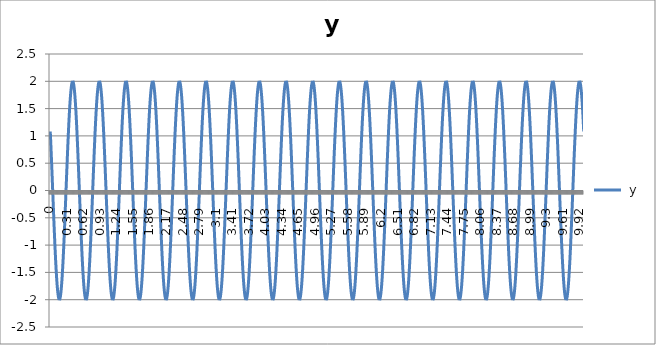
| Category |  y |
|---|---|
| 0.0 | 1.081 |
| 0.01 | 0.861 |
| 0.02 | 0.628 |
| 0.03 | 0.385 |
| 0.04 | 0.136 |
| 0.05 | -0.115 |
| 0.060000000000000005 | -0.364 |
| 0.07 | -0.608 |
| 0.08 | -0.842 |
| 0.09 | -1.063 |
| 0.09999999999999999 | -1.267 |
| 0.10999999999999999 | -1.451 |
| 0.11999999999999998 | -1.612 |
| 0.12999999999999998 | -1.747 |
| 0.13999999999999999 | -1.856 |
| 0.15 | -1.934 |
| 0.16 | -1.983 |
| 0.17 | -2 |
| 0.18000000000000002 | -1.986 |
| 0.19000000000000003 | -1.94 |
| 0.20000000000000004 | -1.863 |
| 0.21000000000000005 | -1.758 |
| 0.22000000000000006 | -1.624 |
| 0.23000000000000007 | -1.465 |
| 0.24000000000000007 | -1.283 |
| 0.25000000000000006 | -1.081 |
| 0.26000000000000006 | -0.861 |
| 0.2700000000000001 | -0.628 |
| 0.2800000000000001 | -0.385 |
| 0.2900000000000001 | -0.136 |
| 0.3000000000000001 | 0.115 |
| 0.3100000000000001 | 0.364 |
| 0.3200000000000001 | 0.608 |
| 0.3300000000000001 | 0.842 |
| 0.34000000000000014 | 1.063 |
| 0.35000000000000014 | 1.267 |
| 0.36000000000000015 | 1.451 |
| 0.37000000000000016 | 1.612 |
| 0.38000000000000017 | 1.747 |
| 0.3900000000000002 | 1.856 |
| 0.4000000000000002 | 1.934 |
| 0.4100000000000002 | 1.983 |
| 0.4200000000000002 | 2 |
| 0.4300000000000002 | 1.986 |
| 0.4400000000000002 | 1.94 |
| 0.45000000000000023 | 1.863 |
| 0.46000000000000024 | 1.758 |
| 0.47000000000000025 | 1.624 |
| 0.48000000000000026 | 1.465 |
| 0.49000000000000027 | 1.283 |
| 0.5000000000000002 | 1.081 |
| 0.5100000000000002 | 0.861 |
| 0.5200000000000002 | 0.628 |
| 0.5300000000000002 | 0.385 |
| 0.5400000000000003 | 0.136 |
| 0.5500000000000003 | -0.115 |
| 0.5600000000000003 | -0.364 |
| 0.5700000000000003 | -0.608 |
| 0.5800000000000003 | -0.842 |
| 0.5900000000000003 | -1.063 |
| 0.6000000000000003 | -1.267 |
| 0.6100000000000003 | -1.451 |
| 0.6200000000000003 | -1.612 |
| 0.6300000000000003 | -1.747 |
| 0.6400000000000003 | -1.856 |
| 0.6500000000000004 | -1.934 |
| 0.6600000000000004 | -1.983 |
| 0.6700000000000004 | -2 |
| 0.6800000000000004 | -1.986 |
| 0.6900000000000004 | -1.94 |
| 0.7000000000000004 | -1.863 |
| 0.7100000000000004 | -1.758 |
| 0.7200000000000004 | -1.624 |
| 0.7300000000000004 | -1.465 |
| 0.7400000000000004 | -1.283 |
| 0.7500000000000004 | -1.081 |
| 0.7600000000000005 | -0.861 |
| 0.7700000000000005 | -0.628 |
| 0.7800000000000005 | -0.385 |
| 0.7900000000000005 | -0.136 |
| 0.8000000000000005 | 0.115 |
| 0.8100000000000005 | 0.364 |
| 0.8200000000000005 | 0.608 |
| 0.8300000000000005 | 0.842 |
| 0.8400000000000005 | 1.063 |
| 0.8500000000000005 | 1.267 |
| 0.8600000000000005 | 1.451 |
| 0.8700000000000006 | 1.612 |
| 0.8800000000000006 | 1.747 |
| 0.8900000000000006 | 1.856 |
| 0.9000000000000006 | 1.934 |
| 0.9100000000000006 | 1.983 |
| 0.9200000000000006 | 2 |
| 0.9300000000000006 | 1.986 |
| 0.9400000000000006 | 1.94 |
| 0.9500000000000006 | 1.863 |
| 0.9600000000000006 | 1.758 |
| 0.9700000000000006 | 1.624 |
| 0.9800000000000006 | 1.465 |
| 0.9900000000000007 | 1.283 |
| 1.0000000000000007 | 1.081 |
| 1.0100000000000007 | 0.861 |
| 1.0200000000000007 | 0.628 |
| 1.0300000000000007 | 0.385 |
| 1.0400000000000007 | 0.136 |
| 1.0500000000000007 | -0.115 |
| 1.0600000000000007 | -0.364 |
| 1.0700000000000007 | -0.608 |
| 1.0800000000000007 | -0.842 |
| 1.0900000000000007 | -1.063 |
| 1.1000000000000008 | -1.267 |
| 1.1100000000000008 | -1.451 |
| 1.1200000000000008 | -1.612 |
| 1.1300000000000008 | -1.747 |
| 1.1400000000000008 | -1.856 |
| 1.1500000000000008 | -1.934 |
| 1.1600000000000008 | -1.983 |
| 1.1700000000000008 | -2 |
| 1.1800000000000008 | -1.986 |
| 1.1900000000000008 | -1.94 |
| 1.2000000000000008 | -1.863 |
| 1.2100000000000009 | -1.758 |
| 1.2200000000000009 | -1.624 |
| 1.2300000000000009 | -1.465 |
| 1.2400000000000009 | -1.283 |
| 1.2500000000000009 | -1.081 |
| 1.260000000000001 | -0.861 |
| 1.270000000000001 | -0.628 |
| 1.280000000000001 | -0.385 |
| 1.290000000000001 | -0.136 |
| 1.300000000000001 | 0.115 |
| 1.310000000000001 | 0.364 |
| 1.320000000000001 | 0.608 |
| 1.330000000000001 | 0.842 |
| 1.340000000000001 | 1.063 |
| 1.350000000000001 | 1.267 |
| 1.360000000000001 | 1.451 |
| 1.370000000000001 | 1.612 |
| 1.380000000000001 | 1.747 |
| 1.390000000000001 | 1.856 |
| 1.400000000000001 | 1.934 |
| 1.410000000000001 | 1.983 |
| 1.420000000000001 | 2 |
| 1.430000000000001 | 1.986 |
| 1.440000000000001 | 1.94 |
| 1.450000000000001 | 1.863 |
| 1.460000000000001 | 1.758 |
| 1.470000000000001 | 1.624 |
| 1.480000000000001 | 1.465 |
| 1.490000000000001 | 1.283 |
| 1.500000000000001 | 1.081 |
| 1.5100000000000011 | 0.861 |
| 1.5200000000000011 | 0.628 |
| 1.5300000000000011 | 0.385 |
| 1.5400000000000011 | 0.136 |
| 1.5500000000000012 | -0.115 |
| 1.5600000000000012 | -0.364 |
| 1.5700000000000012 | -0.608 |
| 1.5800000000000012 | -0.842 |
| 1.5900000000000012 | -1.063 |
| 1.6000000000000012 | -1.267 |
| 1.6100000000000012 | -1.451 |
| 1.6200000000000012 | -1.612 |
| 1.6300000000000012 | -1.747 |
| 1.6400000000000012 | -1.856 |
| 1.6500000000000012 | -1.934 |
| 1.6600000000000013 | -1.983 |
| 1.6700000000000013 | -2 |
| 1.6800000000000013 | -1.986 |
| 1.6900000000000013 | -1.94 |
| 1.7000000000000013 | -1.863 |
| 1.7100000000000013 | -1.758 |
| 1.7200000000000013 | -1.624 |
| 1.7300000000000013 | -1.465 |
| 1.7400000000000013 | -1.283 |
| 1.7500000000000013 | -1.081 |
| 1.7600000000000013 | -0.861 |
| 1.7700000000000014 | -0.628 |
| 1.7800000000000014 | -0.385 |
| 1.7900000000000014 | -0.136 |
| 1.8000000000000014 | 0.115 |
| 1.8100000000000014 | 0.364 |
| 1.8200000000000014 | 0.608 |
| 1.8300000000000014 | 0.842 |
| 1.8400000000000014 | 1.063 |
| 1.8500000000000014 | 1.267 |
| 1.8600000000000014 | 1.451 |
| 1.8700000000000014 | 1.612 |
| 1.8800000000000014 | 1.747 |
| 1.8900000000000015 | 1.856 |
| 1.9000000000000015 | 1.934 |
| 1.9100000000000015 | 1.983 |
| 1.9200000000000015 | 2 |
| 1.9300000000000015 | 1.986 |
| 1.9400000000000015 | 1.94 |
| 1.9500000000000015 | 1.863 |
| 1.9600000000000015 | 1.758 |
| 1.9700000000000015 | 1.624 |
| 1.9800000000000015 | 1.465 |
| 1.9900000000000015 | 1.283 |
| 2.0000000000000013 | 1.081 |
| 2.010000000000001 | 0.861 |
| 2.020000000000001 | 0.628 |
| 2.0300000000000007 | 0.385 |
| 2.0400000000000005 | 0.136 |
| 2.0500000000000003 | -0.115 |
| 2.06 | -0.364 |
| 2.07 | -0.608 |
| 2.0799999999999996 | -0.842 |
| 2.0899999999999994 | -1.063 |
| 2.099999999999999 | -1.267 |
| 2.109999999999999 | -1.451 |
| 2.1199999999999988 | -1.612 |
| 2.1299999999999986 | -1.747 |
| 2.1399999999999983 | -1.856 |
| 2.149999999999998 | -1.934 |
| 2.159999999999998 | -1.983 |
| 2.1699999999999977 | -2 |
| 2.1799999999999975 | -1.986 |
| 2.1899999999999973 | -1.94 |
| 2.199999999999997 | -1.863 |
| 2.209999999999997 | -1.758 |
| 2.2199999999999966 | -1.624 |
| 2.2299999999999964 | -1.465 |
| 2.239999999999996 | -1.283 |
| 2.249999999999996 | -1.081 |
| 2.259999999999996 | -0.861 |
| 2.2699999999999956 | -0.628 |
| 2.2799999999999954 | -0.385 |
| 2.289999999999995 | -0.136 |
| 2.299999999999995 | 0.115 |
| 2.3099999999999947 | 0.364 |
| 2.3199999999999945 | 0.608 |
| 2.3299999999999943 | 0.842 |
| 2.339999999999994 | 1.063 |
| 2.349999999999994 | 1.267 |
| 2.3599999999999937 | 1.451 |
| 2.3699999999999934 | 1.612 |
| 2.3799999999999932 | 1.747 |
| 2.389999999999993 | 1.856 |
| 2.399999999999993 | 1.934 |
| 2.4099999999999926 | 1.983 |
| 2.4199999999999924 | 2 |
| 2.429999999999992 | 1.986 |
| 2.439999999999992 | 1.94 |
| 2.4499999999999917 | 1.863 |
| 2.4599999999999915 | 1.758 |
| 2.4699999999999913 | 1.624 |
| 2.479999999999991 | 1.465 |
| 2.489999999999991 | 1.283 |
| 2.4999999999999907 | 1.081 |
| 2.5099999999999905 | 0.861 |
| 2.5199999999999902 | 0.628 |
| 2.52999999999999 | 0.385 |
| 2.53999999999999 | 0.136 |
| 2.5499999999999896 | -0.115 |
| 2.5599999999999894 | -0.364 |
| 2.569999999999989 | -0.608 |
| 2.579999999999989 | -0.842 |
| 2.5899999999999888 | -1.063 |
| 2.5999999999999885 | -1.267 |
| 2.6099999999999883 | -1.451 |
| 2.619999999999988 | -1.612 |
| 2.629999999999988 | -1.747 |
| 2.6399999999999877 | -1.856 |
| 2.6499999999999875 | -1.934 |
| 2.6599999999999873 | -1.983 |
| 2.669999999999987 | -2 |
| 2.679999999999987 | -1.986 |
| 2.6899999999999866 | -1.94 |
| 2.6999999999999864 | -1.863 |
| 2.709999999999986 | -1.758 |
| 2.719999999999986 | -1.624 |
| 2.7299999999999858 | -1.465 |
| 2.7399999999999856 | -1.283 |
| 2.7499999999999853 | -1.081 |
| 2.759999999999985 | -0.861 |
| 2.769999999999985 | -0.628 |
| 2.7799999999999847 | -0.385 |
| 2.7899999999999845 | -0.136 |
| 2.7999999999999843 | 0.115 |
| 2.809999999999984 | 0.364 |
| 2.819999999999984 | 0.608 |
| 2.8299999999999836 | 0.842 |
| 2.8399999999999834 | 1.063 |
| 2.849999999999983 | 1.267 |
| 2.859999999999983 | 1.451 |
| 2.869999999999983 | 1.612 |
| 2.8799999999999826 | 1.747 |
| 2.8899999999999824 | 1.856 |
| 2.899999999999982 | 1.934 |
| 2.909999999999982 | 1.983 |
| 2.9199999999999817 | 2 |
| 2.9299999999999815 | 1.986 |
| 2.9399999999999813 | 1.94 |
| 2.949999999999981 | 1.863 |
| 2.959999999999981 | 1.758 |
| 2.9699999999999807 | 1.624 |
| 2.9799999999999804 | 1.465 |
| 2.9899999999999802 | 1.283 |
| 2.99999999999998 | 1.081 |
| 3.00999999999998 | 0.861 |
| 3.0199999999999796 | 0.628 |
| 3.0299999999999794 | 0.385 |
| 3.039999999999979 | 0.136 |
| 3.049999999999979 | -0.115 |
| 3.0599999999999787 | -0.364 |
| 3.0699999999999785 | -0.608 |
| 3.0799999999999783 | -0.842 |
| 3.089999999999978 | -1.063 |
| 3.099999999999978 | -1.267 |
| 3.1099999999999777 | -1.451 |
| 3.1199999999999775 | -1.612 |
| 3.1299999999999772 | -1.747 |
| 3.139999999999977 | -1.856 |
| 3.149999999999977 | -1.934 |
| 3.1599999999999766 | -1.983 |
| 3.1699999999999764 | -2 |
| 3.179999999999976 | -1.986 |
| 3.189999999999976 | -1.94 |
| 3.1999999999999758 | -1.863 |
| 3.2099999999999755 | -1.758 |
| 3.2199999999999753 | -1.624 |
| 3.229999999999975 | -1.465 |
| 3.239999999999975 | -1.283 |
| 3.2499999999999747 | -1.081 |
| 3.2599999999999745 | -0.861 |
| 3.2699999999999743 | -0.628 |
| 3.279999999999974 | -0.385 |
| 3.289999999999974 | -0.136 |
| 3.2999999999999736 | 0.115 |
| 3.3099999999999734 | 0.364 |
| 3.319999999999973 | 0.608 |
| 3.329999999999973 | 0.842 |
| 3.3399999999999728 | 1.063 |
| 3.3499999999999726 | 1.267 |
| 3.3599999999999723 | 1.451 |
| 3.369999999999972 | 1.612 |
| 3.379999999999972 | 1.747 |
| 3.3899999999999717 | 1.856 |
| 3.3999999999999715 | 1.934 |
| 3.4099999999999713 | 1.983 |
| 3.419999999999971 | 2 |
| 3.429999999999971 | 1.986 |
| 3.4399999999999706 | 1.94 |
| 3.4499999999999704 | 1.863 |
| 3.45999999999997 | 1.758 |
| 3.46999999999997 | 1.624 |
| 3.47999999999997 | 1.465 |
| 3.4899999999999696 | 1.283 |
| 3.4999999999999694 | 1.081 |
| 3.509999999999969 | 0.861 |
| 3.519999999999969 | 0.628 |
| 3.5299999999999687 | 0.385 |
| 3.5399999999999685 | 0.136 |
| 3.5499999999999683 | -0.115 |
| 3.559999999999968 | -0.364 |
| 3.569999999999968 | -0.608 |
| 3.5799999999999677 | -0.842 |
| 3.5899999999999674 | -1.063 |
| 3.5999999999999672 | -1.267 |
| 3.609999999999967 | -1.451 |
| 3.619999999999967 | -1.612 |
| 3.6299999999999666 | -1.747 |
| 3.6399999999999664 | -1.856 |
| 3.649999999999966 | -1.934 |
| 3.659999999999966 | -1.983 |
| 3.6699999999999657 | -2 |
| 3.6799999999999655 | -1.986 |
| 3.6899999999999653 | -1.94 |
| 3.699999999999965 | -1.863 |
| 3.709999999999965 | -1.758 |
| 3.7199999999999647 | -1.624 |
| 3.7299999999999645 | -1.465 |
| 3.7399999999999642 | -1.283 |
| 3.749999999999964 | -1.081 |
| 3.759999999999964 | -0.861 |
| 3.7699999999999636 | -0.628 |
| 3.7799999999999634 | -0.385 |
| 3.789999999999963 | -0.136 |
| 3.799999999999963 | 0.115 |
| 3.8099999999999627 | 0.364 |
| 3.8199999999999625 | 0.608 |
| 3.8299999999999623 | 0.842 |
| 3.839999999999962 | 1.063 |
| 3.849999999999962 | 1.267 |
| 3.8599999999999617 | 1.451 |
| 3.8699999999999615 | 1.612 |
| 3.8799999999999613 | 1.747 |
| 3.889999999999961 | 1.856 |
| 3.899999999999961 | 1.934 |
| 3.9099999999999606 | 1.983 |
| 3.9199999999999604 | 2 |
| 3.92999999999996 | 1.986 |
| 3.93999999999996 | 1.94 |
| 3.9499999999999598 | 1.863 |
| 3.9599999999999596 | 1.758 |
| 3.9699999999999593 | 1.624 |
| 3.979999999999959 | 1.465 |
| 3.989999999999959 | 1.283 |
| 3.9999999999999587 | 1.081 |
| 4.009999999999959 | 0.861 |
| 4.019999999999959 | 0.628 |
| 4.0299999999999585 | 0.385 |
| 4.039999999999958 | 0.136 |
| 4.049999999999958 | -0.115 |
| 4.059999999999958 | -0.364 |
| 4.069999999999958 | -0.608 |
| 4.079999999999957 | -0.842 |
| 4.089999999999957 | -1.063 |
| 4.099999999999957 | -1.267 |
| 4.109999999999957 | -1.451 |
| 4.119999999999957 | -1.612 |
| 4.129999999999956 | -1.747 |
| 4.139999999999956 | -1.856 |
| 4.149999999999956 | -1.934 |
| 4.159999999999956 | -1.983 |
| 4.1699999999999555 | -2 |
| 4.179999999999955 | -1.986 |
| 4.189999999999955 | -1.94 |
| 4.199999999999955 | -1.863 |
| 4.209999999999955 | -1.758 |
| 4.2199999999999545 | -1.624 |
| 4.229999999999954 | -1.465 |
| 4.239999999999954 | -1.283 |
| 4.249999999999954 | -1.081 |
| 4.259999999999954 | -0.861 |
| 4.269999999999953 | -0.628 |
| 4.279999999999953 | -0.385 |
| 4.289999999999953 | -0.136 |
| 4.299999999999953 | 0.115 |
| 4.3099999999999525 | 0.364 |
| 4.319999999999952 | 0.608 |
| 4.329999999999952 | 0.842 |
| 4.339999999999952 | 1.063 |
| 4.349999999999952 | 1.267 |
| 4.3599999999999515 | 1.451 |
| 4.369999999999951 | 1.612 |
| 4.379999999999951 | 1.747 |
| 4.389999999999951 | 1.856 |
| 4.399999999999951 | 1.934 |
| 4.40999999999995 | 1.983 |
| 4.41999999999995 | 2 |
| 4.42999999999995 | 1.986 |
| 4.43999999999995 | 1.94 |
| 4.4499999999999496 | 1.863 |
| 4.459999999999949 | 1.758 |
| 4.469999999999949 | 1.624 |
| 4.479999999999949 | 1.465 |
| 4.489999999999949 | 1.283 |
| 4.4999999999999485 | 1.081 |
| 4.509999999999948 | 0.861 |
| 4.519999999999948 | 0.628 |
| 4.529999999999948 | 0.385 |
| 4.539999999999948 | 0.136 |
| 4.549999999999947 | -0.115 |
| 4.559999999999947 | -0.364 |
| 4.569999999999947 | -0.608 |
| 4.579999999999947 | -0.842 |
| 4.589999999999947 | -1.063 |
| 4.599999999999946 | -1.267 |
| 4.609999999999946 | -1.451 |
| 4.619999999999946 | -1.612 |
| 4.629999999999946 | -1.747 |
| 4.6399999999999455 | -1.856 |
| 4.649999999999945 | -1.934 |
| 4.659999999999945 | -1.983 |
| 4.669999999999945 | -2 |
| 4.679999999999945 | -1.986 |
| 4.689999999999944 | -1.94 |
| 4.699999999999944 | -1.863 |
| 4.709999999999944 | -1.758 |
| 4.719999999999944 | -1.624 |
| 4.729999999999944 | -1.465 |
| 4.739999999999943 | -1.283 |
| 4.749999999999943 | -1.081 |
| 4.759999999999943 | -0.861 |
| 4.769999999999943 | -0.628 |
| 4.7799999999999425 | -0.385 |
| 4.789999999999942 | -0.136 |
| 4.799999999999942 | 0.115 |
| 4.809999999999942 | 0.364 |
| 4.819999999999942 | 0.608 |
| 4.8299999999999415 | 0.842 |
| 4.839999999999941 | 1.063 |
| 4.849999999999941 | 1.267 |
| 4.859999999999941 | 1.451 |
| 4.869999999999941 | 1.612 |
| 4.87999999999994 | 1.747 |
| 4.88999999999994 | 1.856 |
| 4.89999999999994 | 1.934 |
| 4.90999999999994 | 1.983 |
| 4.9199999999999395 | 2 |
| 4.929999999999939 | 1.986 |
| 4.939999999999939 | 1.94 |
| 4.949999999999939 | 1.863 |
| 4.959999999999939 | 1.758 |
| 4.9699999999999385 | 1.624 |
| 4.979999999999938 | 1.465 |
| 4.989999999999938 | 1.283 |
| 4.999999999999938 | 1.081 |
| 5.009999999999938 | 0.861 |
| 5.019999999999937 | 0.628 |
| 5.029999999999937 | 0.385 |
| 5.039999999999937 | 0.136 |
| 5.049999999999937 | -0.115 |
| 5.0599999999999365 | -0.364 |
| 5.069999999999936 | -0.608 |
| 5.079999999999936 | -0.842 |
| 5.089999999999936 | -1.063 |
| 5.099999999999936 | -1.267 |
| 5.1099999999999355 | -1.451 |
| 5.119999999999935 | -1.612 |
| 5.129999999999935 | -1.747 |
| 5.139999999999935 | -1.856 |
| 5.149999999999935 | -1.934 |
| 5.159999999999934 | -1.983 |
| 5.169999999999934 | -2 |
| 5.179999999999934 | -1.986 |
| 5.189999999999934 | -1.94 |
| 5.199999999999934 | -1.863 |
| 5.209999999999933 | -1.758 |
| 5.219999999999933 | -1.624 |
| 5.229999999999933 | -1.465 |
| 5.239999999999933 | -1.283 |
| 5.2499999999999325 | -1.081 |
| 5.259999999999932 | -0.861 |
| 5.269999999999932 | -0.628 |
| 5.279999999999932 | -0.385 |
| 5.289999999999932 | -0.136 |
| 5.299999999999931 | 0.115 |
| 5.309999999999931 | 0.364 |
| 5.319999999999931 | 0.608 |
| 5.329999999999931 | 0.842 |
| 5.339999999999931 | 1.063 |
| 5.34999999999993 | 1.267 |
| 5.35999999999993 | 1.451 |
| 5.36999999999993 | 1.612 |
| 5.37999999999993 | 1.747 |
| 5.3899999999999295 | 1.856 |
| 5.399999999999929 | 1.934 |
| 5.409999999999929 | 1.983 |
| 5.419999999999929 | 2 |
| 5.429999999999929 | 1.986 |
| 5.4399999999999284 | 1.94 |
| 5.449999999999928 | 1.863 |
| 5.459999999999928 | 1.758 |
| 5.469999999999928 | 1.624 |
| 5.479999999999928 | 1.465 |
| 5.489999999999927 | 1.283 |
| 5.499999999999927 | 1.081 |
| 5.509999999999927 | 0.861 |
| 5.519999999999927 | 0.628 |
| 5.5299999999999265 | 0.385 |
| 5.539999999999926 | 0.136 |
| 5.549999999999926 | -0.115 |
| 5.559999999999926 | -0.364 |
| 5.569999999999926 | -0.608 |
| 5.5799999999999255 | -0.842 |
| 5.589999999999925 | -1.063 |
| 5.599999999999925 | -1.267 |
| 5.609999999999925 | -1.451 |
| 5.619999999999925 | -1.612 |
| 5.629999999999924 | -1.747 |
| 5.639999999999924 | -1.856 |
| 5.649999999999924 | -1.934 |
| 5.659999999999924 | -1.983 |
| 5.6699999999999235 | -2 |
| 5.679999999999923 | -1.986 |
| 5.689999999999923 | -1.94 |
| 5.699999999999923 | -1.863 |
| 5.709999999999923 | -1.758 |
| 5.7199999999999225 | -1.624 |
| 5.729999999999922 | -1.465 |
| 5.739999999999922 | -1.283 |
| 5.749999999999922 | -1.081 |
| 5.759999999999922 | -0.861 |
| 5.769999999999921 | -0.628 |
| 5.779999999999921 | -0.385 |
| 5.789999999999921 | -0.136 |
| 5.799999999999921 | 0.115 |
| 5.809999999999921 | 0.364 |
| 5.81999999999992 | 0.608 |
| 5.82999999999992 | 0.842 |
| 5.83999999999992 | 1.063 |
| 5.84999999999992 | 1.267 |
| 5.8599999999999195 | 1.451 |
| 5.869999999999919 | 1.612 |
| 5.879999999999919 | 1.747 |
| 5.889999999999919 | 1.856 |
| 5.899999999999919 | 1.934 |
| 5.909999999999918 | 1.983 |
| 5.919999999999918 | 2 |
| 5.929999999999918 | 1.986 |
| 5.939999999999918 | 1.94 |
| 5.949999999999918 | 1.863 |
| 5.959999999999917 | 1.758 |
| 5.969999999999917 | 1.624 |
| 5.979999999999917 | 1.465 |
| 5.989999999999917 | 1.283 |
| 5.9999999999999165 | 1.081 |
| 6.009999999999916 | 0.861 |
| 6.019999999999916 | 0.628 |
| 6.029999999999916 | 0.385 |
| 6.039999999999916 | 0.136 |
| 6.0499999999999154 | -0.115 |
| 6.059999999999915 | -0.364 |
| 6.069999999999915 | -0.608 |
| 6.079999999999915 | -0.842 |
| 6.089999999999915 | -1.063 |
| 6.099999999999914 | -1.267 |
| 6.109999999999914 | -1.451 |
| 6.119999999999914 | -1.612 |
| 6.129999999999914 | -1.747 |
| 6.1399999999999135 | -1.856 |
| 6.149999999999913 | -1.934 |
| 6.159999999999913 | -1.983 |
| 6.169999999999913 | -2 |
| 6.179999999999913 | -1.986 |
| 6.1899999999999125 | -1.94 |
| 6.199999999999912 | -1.863 |
| 6.209999999999912 | -1.758 |
| 6.219999999999912 | -1.624 |
| 6.229999999999912 | -1.465 |
| 6.239999999999911 | -1.283 |
| 6.249999999999911 | -1.081 |
| 6.259999999999911 | -0.861 |
| 6.269999999999911 | -0.628 |
| 6.2799999999999105 | -0.385 |
| 6.28999999999991 | -0.136 |
| 6.29999999999991 | 0.115 |
| 6.30999999999991 | 0.364 |
| 6.31999999999991 | 0.608 |
| 6.3299999999999095 | 0.842 |
| 6.339999999999909 | 1.063 |
| 6.349999999999909 | 1.267 |
| 6.359999999999909 | 1.451 |
| 6.369999999999909 | 1.612 |
| 6.379999999999908 | 1.747 |
| 6.389999999999908 | 1.856 |
| 6.399999999999908 | 1.934 |
| 6.409999999999908 | 1.983 |
| 6.419999999999908 | 2 |
| 6.429999999999907 | 1.986 |
| 6.439999999999907 | 1.94 |
| 6.449999999999907 | 1.863 |
| 6.459999999999907 | 1.758 |
| 6.4699999999999065 | 1.624 |
| 6.479999999999906 | 1.465 |
| 6.489999999999906 | 1.283 |
| 6.499999999999906 | 1.081 |
| 6.509999999999906 | 0.861 |
| 6.519999999999905 | 0.628 |
| 6.529999999999905 | 0.385 |
| 6.539999999999905 | 0.136 |
| 6.549999999999905 | -0.115 |
| 6.559999999999905 | -0.364 |
| 6.569999999999904 | -0.608 |
| 6.579999999999904 | -0.842 |
| 6.589999999999904 | -1.063 |
| 6.599999999999904 | -1.267 |
| 6.6099999999999035 | -1.451 |
| 6.619999999999903 | -1.612 |
| 6.629999999999903 | -1.747 |
| 6.639999999999903 | -1.856 |
| 6.649999999999903 | -1.934 |
| 6.659999999999902 | -1.983 |
| 6.669999999999902 | -2 |
| 6.679999999999902 | -1.986 |
| 6.689999999999902 | -1.94 |
| 6.699999999999902 | -1.863 |
| 6.709999999999901 | -1.758 |
| 6.719999999999901 | -1.624 |
| 6.729999999999901 | -1.465 |
| 6.739999999999901 | -1.283 |
| 6.7499999999999005 | -1.081 |
| 6.7599999999999 | -0.861 |
| 6.7699999999999 | -0.628 |
| 6.7799999999999 | -0.385 |
| 6.7899999999999 | -0.136 |
| 6.7999999999998995 | 0.115 |
| 6.809999999999899 | 0.364 |
| 6.819999999999899 | 0.608 |
| 6.829999999999899 | 0.842 |
| 6.839999999999899 | 1.063 |
| 6.849999999999898 | 1.267 |
| 6.859999999999898 | 1.451 |
| 6.869999999999898 | 1.612 |
| 6.879999999999898 | 1.747 |
| 6.8899999999998975 | 1.856 |
| 6.899999999999897 | 1.934 |
| 6.909999999999897 | 1.983 |
| 6.919999999999897 | 2 |
| 6.929999999999897 | 1.986 |
| 6.9399999999998965 | 1.94 |
| 6.949999999999896 | 1.863 |
| 6.959999999999896 | 1.758 |
| 6.969999999999896 | 1.624 |
| 6.979999999999896 | 1.465 |
| 6.989999999999895 | 1.283 |
| 6.999999999999895 | 1.081 |
| 7.009999999999895 | 0.861 |
| 7.019999999999895 | 0.628 |
| 7.0299999999998946 | 0.385 |
| 7.039999999999894 | 0.136 |
| 7.049999999999894 | -0.115 |
| 7.059999999999894 | -0.364 |
| 7.069999999999894 | -0.608 |
| 7.0799999999998935 | -0.842 |
| 7.089999999999893 | -1.063 |
| 7.099999999999893 | -1.267 |
| 7.109999999999893 | -1.451 |
| 7.119999999999893 | -1.612 |
| 7.129999999999892 | -1.747 |
| 7.139999999999892 | -1.856 |
| 7.149999999999892 | -1.934 |
| 7.159999999999892 | -1.983 |
| 7.169999999999892 | -2 |
| 7.179999999999891 | -1.986 |
| 7.189999999999891 | -1.94 |
| 7.199999999999891 | -1.863 |
| 7.209999999999891 | -1.758 |
| 7.2199999999998905 | -1.624 |
| 7.22999999999989 | -1.465 |
| 7.23999999999989 | -1.283 |
| 7.24999999999989 | -1.081 |
| 7.25999999999989 | -0.861 |
| 7.269999999999889 | -0.628 |
| 7.279999999999889 | -0.385 |
| 7.289999999999889 | -0.136 |
| 7.299999999999889 | 0.115 |
| 7.309999999999889 | 0.364 |
| 7.319999999999888 | 0.608 |
| 7.329999999999888 | 0.842 |
| 7.339999999999888 | 1.063 |
| 7.349999999999888 | 1.267 |
| 7.3599999999998875 | 1.451 |
| 7.369999999999887 | 1.612 |
| 7.379999999999887 | 1.747 |
| 7.389999999999887 | 1.856 |
| 7.399999999999887 | 1.934 |
| 7.4099999999998865 | 1.983 |
| 7.419999999999886 | 2 |
| 7.429999999999886 | 1.986 |
| 7.439999999999886 | 1.94 |
| 7.449999999999886 | 1.863 |
| 7.459999999999885 | 1.758 |
| 7.469999999999885 | 1.624 |
| 7.479999999999885 | 1.465 |
| 7.489999999999885 | 1.283 |
| 7.4999999999998845 | 1.081 |
| 7.509999999999884 | 0.861 |
| 7.519999999999884 | 0.628 |
| 7.529999999999884 | 0.385 |
| 7.539999999999884 | 0.136 |
| 7.5499999999998835 | -0.115 |
| 7.559999999999883 | -0.364 |
| 7.569999999999883 | -0.608 |
| 7.579999999999883 | -0.842 |
| 7.589999999999883 | -1.063 |
| 7.599999999999882 | -1.267 |
| 7.609999999999882 | -1.451 |
| 7.619999999999882 | -1.612 |
| 7.629999999999882 | -1.747 |
| 7.6399999999998816 | -1.856 |
| 7.649999999999881 | -1.934 |
| 7.659999999999881 | -1.983 |
| 7.669999999999881 | -2 |
| 7.679999999999881 | -1.986 |
| 7.6899999999998805 | -1.94 |
| 7.69999999999988 | -1.863 |
| 7.70999999999988 | -1.758 |
| 7.71999999999988 | -1.624 |
| 7.72999999999988 | -1.465 |
| 7.739999999999879 | -1.283 |
| 7.749999999999879 | -1.081 |
| 7.759999999999879 | -0.861 |
| 7.769999999999879 | -0.628 |
| 7.779999999999879 | -0.385 |
| 7.789999999999878 | -0.136 |
| 7.799999999999878 | 0.115 |
| 7.809999999999878 | 0.364 |
| 7.819999999999878 | 0.608 |
| 7.8299999999998775 | 0.842 |
| 7.839999999999877 | 1.063 |
| 7.849999999999877 | 1.267 |
| 7.859999999999877 | 1.451 |
| 7.869999999999877 | 1.612 |
| 7.879999999999876 | 1.747 |
| 7.889999999999876 | 1.856 |
| 7.899999999999876 | 1.934 |
| 7.909999999999876 | 1.983 |
| 7.919999999999876 | 2 |
| 7.929999999999875 | 1.986 |
| 7.939999999999875 | 1.94 |
| 7.949999999999875 | 1.863 |
| 7.959999999999875 | 1.758 |
| 7.9699999999998745 | 1.624 |
| 7.979999999999874 | 1.465 |
| 7.989999999999874 | 1.283 |
| 7.999999999999874 | 1.081 |
| 8.009999999999874 | 0.861 |
| 8.019999999999873 | 0.628 |
| 8.029999999999873 | 0.385 |
| 8.039999999999873 | 0.136 |
| 8.049999999999873 | -0.115 |
| 8.059999999999873 | -0.364 |
| 8.069999999999872 | -0.608 |
| 8.079999999999872 | -0.842 |
| 8.089999999999872 | -1.063 |
| 8.099999999999872 | -1.267 |
| 8.109999999999872 | -1.451 |
| 8.119999999999871 | -1.612 |
| 8.129999999999871 | -1.747 |
| 8.139999999999871 | -1.856 |
| 8.14999999999987 | -1.934 |
| 8.15999999999987 | -1.983 |
| 8.16999999999987 | -2 |
| 8.17999999999987 | -1.986 |
| 8.18999999999987 | -1.94 |
| 8.19999999999987 | -1.863 |
| 8.20999999999987 | -1.758 |
| 8.21999999999987 | -1.624 |
| 8.229999999999869 | -1.465 |
| 8.239999999999869 | -1.283 |
| 8.249999999999869 | -1.081 |
| 8.259999999999868 | -0.861 |
| 8.269999999999868 | -0.628 |
| 8.279999999999868 | -0.385 |
| 8.289999999999868 | -0.136 |
| 8.299999999999867 | 0.115 |
| 8.309999999999867 | 0.364 |
| 8.319999999999867 | 0.608 |
| 8.329999999999867 | 0.842 |
| 8.339999999999867 | 1.063 |
| 8.349999999999866 | 1.267 |
| 8.359999999999866 | 1.451 |
| 8.369999999999866 | 1.612 |
| 8.379999999999866 | 1.747 |
| 8.389999999999866 | 1.856 |
| 8.399999999999865 | 1.934 |
| 8.409999999999865 | 1.983 |
| 8.419999999999865 | 2 |
| 8.429999999999865 | 1.986 |
| 8.439999999999864 | 1.94 |
| 8.449999999999864 | 1.863 |
| 8.459999999999864 | 1.758 |
| 8.469999999999864 | 1.624 |
| 8.479999999999864 | 1.465 |
| 8.489999999999863 | 1.283 |
| 8.499999999999863 | 1.081 |
| 8.509999999999863 | 0.861 |
| 8.519999999999863 | 0.628 |
| 8.529999999999863 | 0.385 |
| 8.539999999999862 | 0.136 |
| 8.549999999999862 | -0.115 |
| 8.559999999999862 | -0.364 |
| 8.569999999999862 | -0.608 |
| 8.579999999999862 | -0.842 |
| 8.589999999999861 | -1.063 |
| 8.599999999999861 | -1.267 |
| 8.60999999999986 | -1.451 |
| 8.61999999999986 | -1.612 |
| 8.62999999999986 | -1.747 |
| 8.63999999999986 | -1.856 |
| 8.64999999999986 | -1.934 |
| 8.65999999999986 | -1.983 |
| 8.66999999999986 | -2 |
| 8.67999999999986 | -1.986 |
| 8.68999999999986 | -1.94 |
| 8.699999999999859 | -1.863 |
| 8.709999999999859 | -1.758 |
| 8.719999999999859 | -1.624 |
| 8.729999999999858 | -1.465 |
| 8.739999999999858 | -1.283 |
| 8.749999999999858 | -1.081 |
| 8.759999999999858 | -0.861 |
| 8.769999999999857 | -0.628 |
| 8.779999999999857 | -0.385 |
| 8.789999999999857 | -0.136 |
| 8.799999999999857 | 0.115 |
| 8.809999999999857 | 0.364 |
| 8.819999999999856 | 0.608 |
| 8.829999999999856 | 0.842 |
| 8.839999999999856 | 1.063 |
| 8.849999999999856 | 1.267 |
| 8.859999999999856 | 1.451 |
| 8.869999999999855 | 1.612 |
| 8.879999999999855 | 1.747 |
| 8.889999999999855 | 1.856 |
| 8.899999999999855 | 1.934 |
| 8.909999999999854 | 1.983 |
| 8.919999999999854 | 2 |
| 8.929999999999854 | 1.986 |
| 8.939999999999854 | 1.94 |
| 8.949999999999854 | 1.863 |
| 8.959999999999853 | 1.758 |
| 8.969999999999853 | 1.624 |
| 8.979999999999853 | 1.465 |
| 8.989999999999853 | 1.283 |
| 8.999999999999853 | 1.081 |
| 9.009999999999852 | 0.861 |
| 9.019999999999852 | 0.628 |
| 9.029999999999852 | 0.385 |
| 9.039999999999852 | 0.136 |
| 9.049999999999851 | -0.115 |
| 9.059999999999851 | -0.364 |
| 9.069999999999851 | -0.608 |
| 9.07999999999985 | -0.842 |
| 9.08999999999985 | -1.063 |
| 9.09999999999985 | -1.267 |
| 9.10999999999985 | -1.451 |
| 9.11999999999985 | -1.612 |
| 9.12999999999985 | -1.747 |
| 9.13999999999985 | -1.856 |
| 9.14999999999985 | -1.934 |
| 9.15999999999985 | -1.983 |
| 9.169999999999849 | -2 |
| 9.179999999999849 | -1.986 |
| 9.189999999999849 | -1.94 |
| 9.199999999999848 | -1.863 |
| 9.209999999999848 | -1.758 |
| 9.219999999999848 | -1.624 |
| 9.229999999999848 | -1.465 |
| 9.239999999999847 | -1.283 |
| 9.249999999999847 | -1.081 |
| 9.259999999999847 | -0.861 |
| 9.269999999999847 | -0.628 |
| 9.279999999999847 | -0.385 |
| 9.289999999999846 | -0.136 |
| 9.299999999999846 | 0.115 |
| 9.309999999999846 | 0.364 |
| 9.319999999999846 | 0.608 |
| 9.329999999999846 | 0.842 |
| 9.339999999999845 | 1.063 |
| 9.349999999999845 | 1.267 |
| 9.359999999999845 | 1.451 |
| 9.369999999999845 | 1.612 |
| 9.379999999999844 | 1.747 |
| 9.389999999999844 | 1.856 |
| 9.399999999999844 | 1.934 |
| 9.409999999999844 | 1.983 |
| 9.419999999999844 | 2 |
| 9.429999999999843 | 1.986 |
| 9.439999999999843 | 1.94 |
| 9.449999999999843 | 1.863 |
| 9.459999999999843 | 1.758 |
| 9.469999999999843 | 1.624 |
| 9.479999999999842 | 1.465 |
| 9.489999999999842 | 1.283 |
| 9.499999999999842 | 1.081 |
| 9.509999999999842 | 0.861 |
| 9.519999999999841 | 0.628 |
| 9.529999999999841 | 0.385 |
| 9.539999999999841 | 0.136 |
| 9.54999999999984 | -0.115 |
| 9.55999999999984 | -0.364 |
| 9.56999999999984 | -0.608 |
| 9.57999999999984 | -0.842 |
| 9.58999999999984 | -1.063 |
| 9.59999999999984 | -1.267 |
| 9.60999999999984 | -1.451 |
| 9.61999999999984 | -1.612 |
| 9.62999999999984 | -1.747 |
| 9.639999999999839 | -1.856 |
| 9.649999999999839 | -1.934 |
| 9.659999999999838 | -1.983 |
| 9.669999999999838 | -2 |
| 9.679999999999838 | -1.986 |
| 9.689999999999838 | -1.94 |
| 9.699999999999838 | -1.863 |
| 9.709999999999837 | -1.758 |
| 9.719999999999837 | -1.624 |
| 9.729999999999837 | -1.465 |
| 9.739999999999837 | -1.283 |
| 9.749999999999837 | -1.081 |
| 9.759999999999836 | -0.861 |
| 9.769999999999836 | -0.628 |
| 9.779999999999836 | -0.385 |
| 9.789999999999836 | -0.136 |
| 9.799999999999836 | 0.115 |
| 9.809999999999835 | 0.364 |
| 9.819999999999835 | 0.608 |
| 9.829999999999835 | 0.842 |
| 9.839999999999835 | 1.063 |
| 9.849999999999834 | 1.267 |
| 9.859999999999834 | 1.451 |
| 9.869999999999834 | 1.612 |
| 9.879999999999834 | 1.747 |
| 9.889999999999834 | 1.856 |
| 9.899999999999833 | 1.934 |
| 9.909999999999833 | 1.983 |
| 9.919999999999833 | 2 |
| 9.929999999999833 | 1.986 |
| 9.939999999999833 | 1.94 |
| 9.949999999999832 | 1.863 |
| 9.959999999999832 | 1.758 |
| 9.969999999999832 | 1.624 |
| 9.979999999999832 | 1.465 |
| 9.989999999999831 | 1.283 |
| 9.999999999999831 | 1.081 |